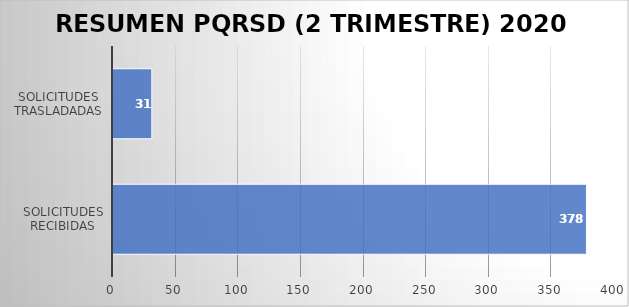
| Category | Series 0 |
|---|---|
| Solicitudes Recibidas | 378 |
| Solicitudes Trasladadas | 31 |